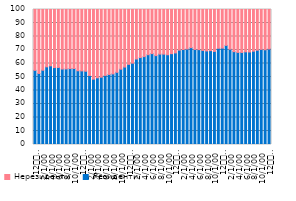
| Category | Резиденти | Нерезиденти |
|---|---|---|
| 12
2013. | 54.939 | 45.061 |
| 1 | 52.632 | 47.368 |
| 2 | 55.024 | 44.976 |
| 3 | 57.529 | 42.471 |
| 4 | 58.275 | 41.725 |
| 5 | 56.994 | 43.006 |
| 6 | 57.079 | 42.921 |
| 7 | 55.908 | 44.092 |
| 8 | 55.99 | 44.01 |
| 9 | 56.259 | 43.741 |
| 10 | 56.316 | 43.684 |
| 11 | 54.626 | 45.374 |
| 12
2014. | 54.518 | 45.482 |
| 1 | 54.275 | 45.725 |
| 2 | 51.149 | 48.851 |
| 3 | 48.387 | 51.613 |
| 4 | 49.394 | 50.606 |
| 5 | 49.863 | 50.137 |
| 6 | 51.173 | 48.827 |
| 7 | 51.916 | 48.084 |
| 8 | 52.313 | 47.687 |
| 9 | 53.486 | 46.514 |
| 10 | 55.78 | 44.22 |
| 11 | 57.361 | 42.639 |
| 12
2015. | 59.38 | 40.62 |
| 1 | 60.252 | 39.748 |
| 2 | 63.321 | 36.679 |
| 3 | 64.419 | 35.581 |
| 4 | 65.102 | 34.898 |
| 5 | 66.515 | 33.485 |
| 6 | 67.33 | 32.67 |
| 7 | 65.846 | 34.154 |
| 8 | 66.966 | 33.034 |
| 9 | 66.935 | 33.065 |
| 10 | 66.482 | 33.518 |
| 11 | 67.293 | 32.707 |
| 12
2016. | 67.823 | 32.177 |
| 1 | 69.888 | 30.112 |
| 2 | 70.36 | 29.64 |
| 3 | 70.739 | 29.261 |
| 4 | 71.751 | 28.249 |
| 5 | 70.41 | 29.59 |
| 6 | 70.279 | 29.721 |
| 7 | 69.666 | 30.334 |
| 8 | 69.318 | 30.682 |
| 9 | 69.544 | 30.456 |
| 10 | 68.976 | 31.024 |
| 11 | 71.255 | 28.745 |
| 12
2017. | 71.404 | 28.596 |
| 1 | 73.407 | 26.593 |
| 2 | 70.601 | 29.399 |
| 3 | 68.779 | 31.221 |
| 4 | 68.22 | 31.78 |
| 5 | 68.185 | 31.815 |
| 6 | 68.639 | 31.361 |
| 7 | 68.533 | 31.467 |
| 8 | 69.133 | 30.867 |
| 9 | 69.84 | 30.16 |
| 10 | 70.47 | 29.53 |
| 11 | 70.173 | 29.827 |
| 12
2018. | 70.775 | 29.225 |